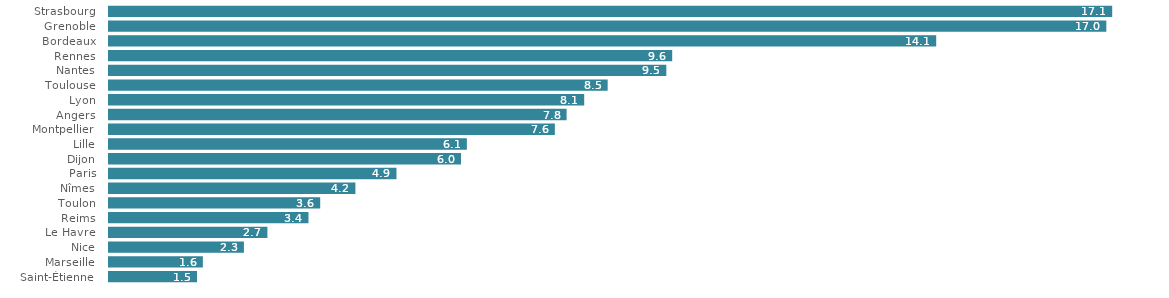
| Category | Vélo |
|---|---|
| Saint-Étienne | 1.5 |
| Marseille | 1.6 |
| Nice | 2.3 |
| Le Havre | 2.7 |
| Reims | 3.4 |
| Toulon | 3.6 |
| Nîmes | 4.2 |
| Paris | 4.9 |
| Dijon | 6 |
| Lille | 6.1 |
| Montpellier | 7.6 |
| Angers | 7.8 |
| Lyon | 8.1 |
| Toulouse | 8.5 |
| Nantes | 9.5 |
| Rennes | 9.6 |
| Bordeaux | 14.1 |
| Grenoble | 17 |
| Strasbourg | 17.1 |